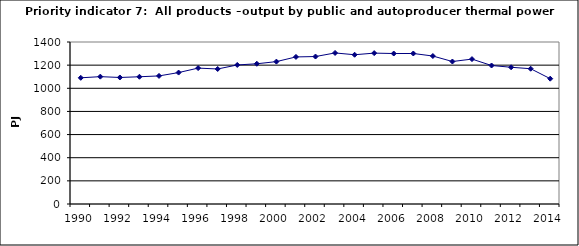
| Category | All products –output by public and autoproducer thermal power stations, PJ |
|---|---|
| 1990 | 1090.57 |
| 1991 | 1100.534 |
| 1992 | 1093.374 |
| 1993 | 1099.559 |
| 1994 | 1106.914 |
| 1995 | 1135.836 |
| 1996 | 1174.446 |
| 1997 | 1166.879 |
| 1998 | 1201.55 |
| 1999 | 1211.789 |
| 2000 | 1230.419 |
| 2001 | 1271.005 |
| 2002 | 1274.377 |
| 2003 | 1305.361 |
| 2004 | 1289.928 |
| 2005 | 1303.964 |
| 2006 | 1300.435 |
| 2007 | 1300.742 |
| 2008 | 1278.86 |
| 2009 | 1231.239 |
| 2010 | 1252.245 |
| 2011 | 1196.861 |
| 2012 | 1181.772 |
| 2013 | 1169.01 |
| 2014 | 1082.962 |